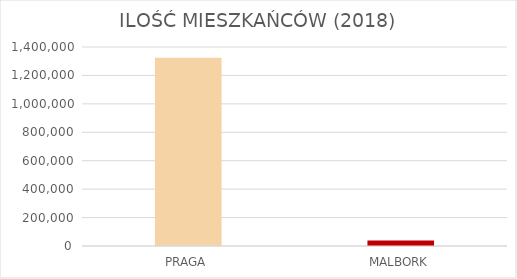
| Category | Series 0 |
|---|---|
| PRAGA | 1324277 |
| MALBORK | 38723 |